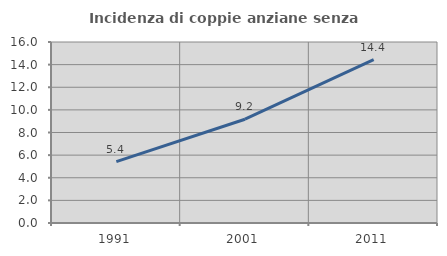
| Category | Incidenza di coppie anziane senza figli  |
|---|---|
| 1991.0 | 5.421 |
| 2001.0 | 9.174 |
| 2011.0 | 14.444 |